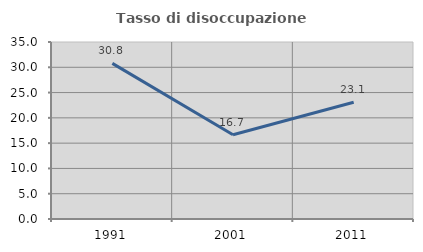
| Category | Tasso di disoccupazione giovanile  |
|---|---|
| 1991.0 | 30.769 |
| 2001.0 | 16.667 |
| 2011.0 | 23.077 |